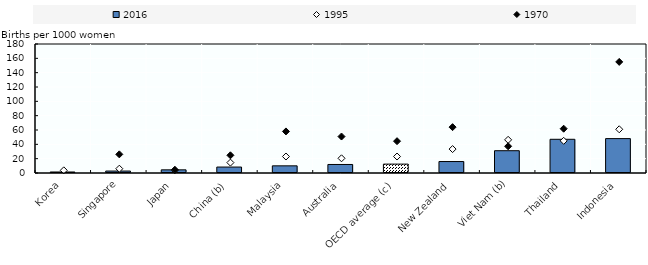
| Category | 2016 |
|---|---|
| Korea | 1.4 |
| Singapore | 2.72 |
| Japan | 4.413 |
| China (b) | 8.3 |
| Malaysia | 10 |
| Australia | 11.9 |
| OECD average (c) | 12.4 |
| New Zealand | 16 |
| Viet Nam (b) | 31.1 |
| Thailand | 47.032 |
| Indonesia | 48 |